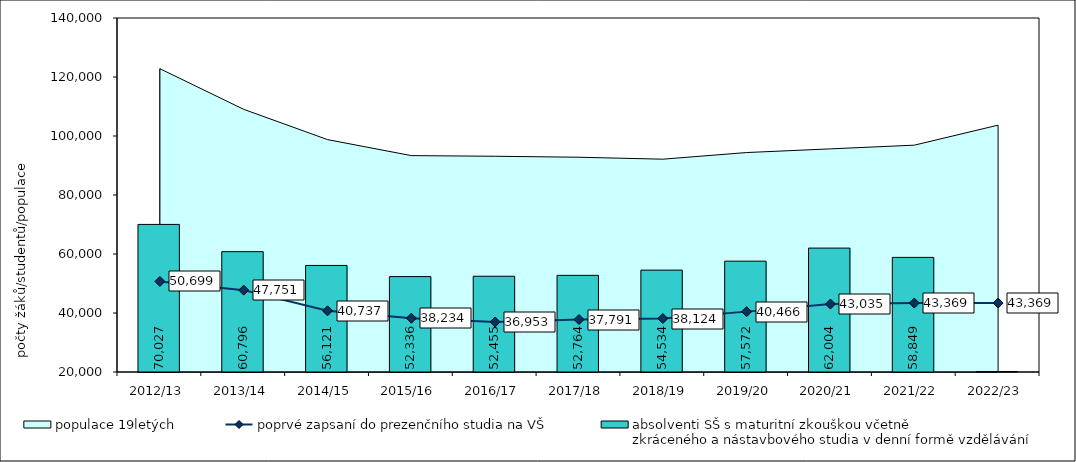
| Category | absolventi SŠ s maturitní zkouškou včetně 
zkráceného a nástavbového studia v denní formě vzdělávání  |
|---|---|
| 2012/13 | 70027 |
| 2013/14 | 60796 |
| 2014/15 | 56121 |
| 2015/16 | 52336 |
| 2016/17 | 52455 |
| 2017/18 | 52764 |
| 2018/19 | 54534 |
| 2019/20 | 57572 |
| 2020/21 | 62004 |
| 2021/22 | 58849 |
| 2022/23 | 0 |